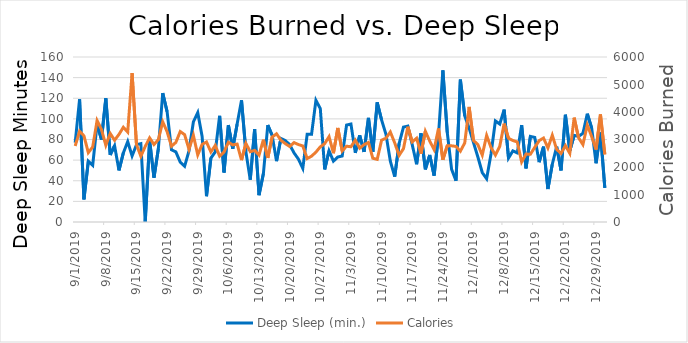
| Category | Deep Sleep (min.) |
|---|---|
| 9/1/19 | 77 |
| 9/2/19 | 119 |
| 9/3/19 | 22 |
| 9/4/19 | 59 |
| 9/5/19 | 55 |
| 9/6/19 | 95 |
| 9/7/19 | 80 |
| 9/8/19 | 120 |
| 9/9/19 | 65 |
| 9/10/19 | 74 |
| 9/11/19 | 50 |
| 9/12/19 | 67 |
| 9/13/19 | 78 |
| 9/14/19 | 64 |
| 9/15/19 | 75 |
| 9/16/19 | 76 |
| 9/17/19 | 0 |
| 9/18/19 | 79 |
| 9/19/19 | 43 |
| 9/20/19 | 71 |
| 9/21/19 | 125 |
| 9/22/19 | 107 |
| 9/23/19 | 70 |
| 9/24/19 | 68 |
| 9/25/19 | 58 |
| 9/26/19 | 54 |
| 9/27/19 | 69 |
| 9/28/19 | 97 |
| 9/29/19 | 106 |
| 9/30/19 | 83 |
| 10/1/19 | 25 |
| 10/2/19 | 62 |
| 10/3/19 | 68 |
| 10/4/19 | 103 |
| 10/5/19 | 48 |
| 10/6/19 | 94 |
| 10/7/19 | 71 |
| 10/8/19 | 95 |
| 10/9/19 | 118 |
| 10/10/19 | 68 |
| 10/11/19 | 41 |
| 10/12/19 | 90 |
| 10/13/19 | 26 |
| 10/14/19 | 47 |
| 10/15/19 | 94 |
| 10/16/19 | 84 |
| 10/17/19 | 59 |
| 10/18/19 | 81 |
| 10/19/19 | 79 |
| 10/20/19 | 75 |
| 10/21/19 | 67 |
| 10/22/19 | 61 |
| 10/23/19 | 52 |
| 10/24/19 | 85 |
| 10/25/19 | 85 |
| 10/26/19 | 118 |
| 10/27/19 | 110 |
| 10/28/19 | 51 |
| 10/29/19 | 69 |
| 10/30/19 | 59 |
| 10/31/19 | 63 |
| 11/1/19 | 64 |
| 11/2/19 | 94 |
| 11/3/19 | 95 |
| 11/4/19 | 67 |
| 11/5/19 | 84 |
| 11/6/19 | 68 |
| 11/7/19 | 101 |
| 11/8/19 | 68 |
| 11/9/19 | 116 |
| 11/10/19 | 99 |
| 11/11/19 | 85 |
| 11/12/19 | 59 |
| 11/13/19 | 44 |
| 11/14/19 | 76 |
| 11/15/19 | 92 |
| 11/16/19 | 93 |
| 11/17/19 | 75 |
| 11/18/19 | 56 |
| 11/19/19 | 86 |
| 11/20/19 | 51 |
| 11/21/19 | 65 |
| 11/22/19 | 45 |
| 11/23/19 | 84 |
| 11/24/19 | 147 |
| 11/25/19 | 87 |
| 11/26/19 | 51 |
| 11/27/19 | 40 |
| 11/28/19 | 138 |
| 11/29/19 | 103 |
| 11/30/19 | 91 |
| 12/1/19 | 77 |
| 12/2/19 | 63 |
| 12/3/19 | 48 |
| 12/4/19 | 42 |
| 12/5/19 | 66 |
| 12/6/19 | 98 |
| 12/7/19 | 95 |
| 12/8/19 | 109 |
| 12/9/19 | 62 |
| 12/10/19 | 69 |
| 12/11/19 | 67 |
| 12/12/19 | 94 |
| 12/13/19 | 52 |
| 12/14/19 | 83 |
| 12/15/19 | 82 |
| 12/16/19 | 58 |
| 12/17/19 | 73 |
| 12/18/19 | 32 |
| 12/19/19 | 56 |
| 12/20/19 | 73 |
| 12/21/19 | 50 |
| 12/22/19 | 104 |
| 12/23/19 | 69 |
| 12/24/19 | 84 |
| 12/25/19 | 83 |
| 12/26/19 | 86 |
| 12/27/19 | 105 |
| 12/28/19 | 91 |
| 12/29/19 | 57 |
| 12/30/19 | 87 |
| 12/31/19 | 33 |